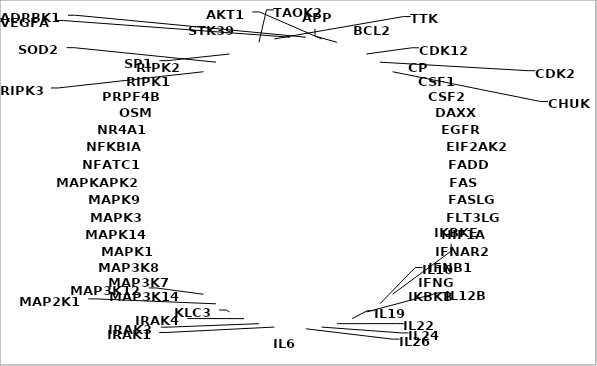
| Category | Series 0 |
|---|---|
| ADRBK1 | 1 |
| AKT1 | 1 |
| APP | 1 |
| BCL2 | 1 |
| CDK12 | 1 |
| CDK2 | 1 |
| CHUK | 1 |
| CP | 1 |
| CSF1 | 1 |
| CSF2 | 1 |
| DAXX | 1 |
| EGFR | 1 |
| EIF2AK2 | 1 |
| FADD | 1 |
| FAS | 1 |
| FASLG | 1 |
| FLT3LG | 1 |
| HIF1A | 1 |
| IFNAR2 | 1 |
| IFNB1 | 1 |
| IFNG | 1 |
| IKBKB | 1 |
| IKBKE | 1 |
| IL10 | 1 |
| IL12B | 1 |
| IL19 | 1 |
| IL22 | 1 |
| IL24 | 1 |
| IL26 | 1 |
| IL6 | 1 |
| IRAK1 | 1 |
| IRAK3 | 1 |
| IRAK4 | 1 |
| KLC3 | 1 |
| MAP2K1 | 1 |
| MAP3K12 | 1 |
| MAP3K14 | 1 |
| MAP3K7 | 1 |
| MAP3K8 | 1 |
| MAPK1 | 1 |
| MAPK14 | 1 |
| MAPK3 | 1 |
| MAPK9 | 1 |
| MAPKAPK2 | 1 |
| NFATC1 | 1 |
| NFKBIA | 1 |
| NR4A1 | 1 |
| OSM | 1 |
| PRPF4B | 1 |
| RIPK1 | 1 |
| RIPK2 | 1 |
| RIPK3 | 1 |
| SOD2 | 1 |
| SP1 | 1 |
| STK39 | 1 |
| TAOK2 | 1 |
| TTK | 1 |
| VEGFA | 1 |